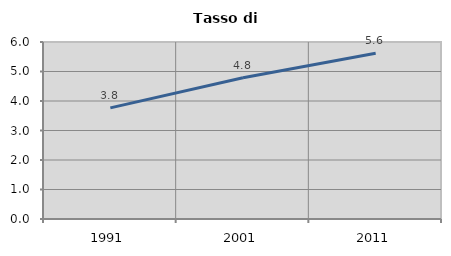
| Category | Tasso di disoccupazione   |
|---|---|
| 1991.0 | 3.766 |
| 2001.0 | 4.786 |
| 2011.0 | 5.62 |